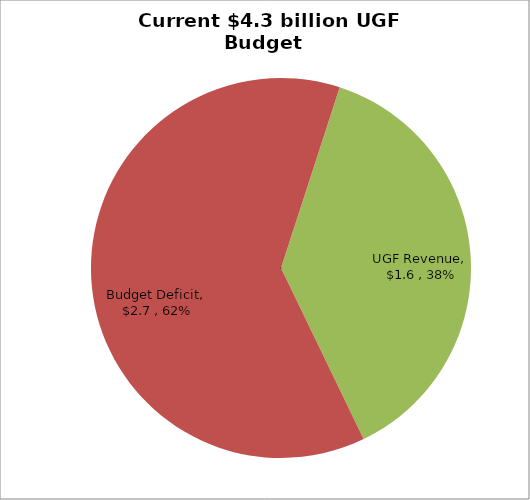
| Category | Series 0 |
|---|---|
| UGF Revenue | 1.624 |
| Budget Deficit | 2.668 |